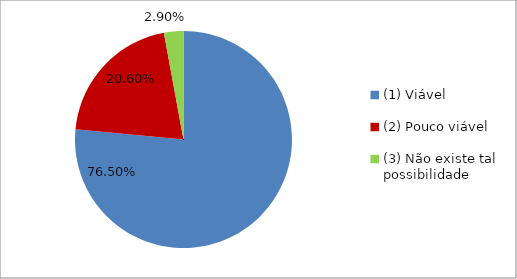
| Category | Series 0 |
|---|---|
| (1) Viável | 0.765 |
| (2) Pouco viável | 0.206 |
| (3) Não existe tal possibilidade | 0.029 |